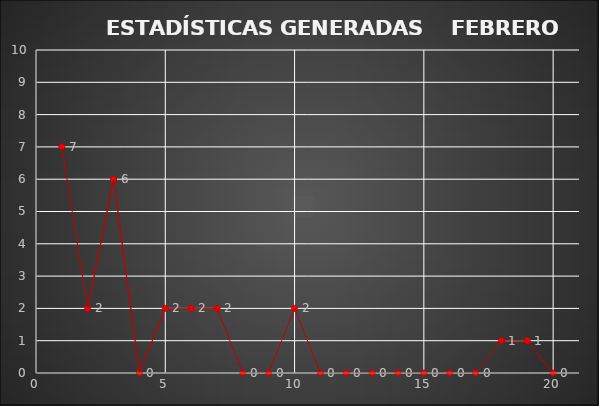
| Category |      ESTADÍSTICAS GENERADAS     PERIODO ENERO 2020 CANTIDAD |
|---|---|
| 0 | 7 |
| 1 | 2 |
| 2 | 6 |
| 3 | 0 |
| 4 | 2 |
| 5 | 2 |
| 6 | 2 |
| 7 | 0 |
| 8 | 0 |
| 9 | 2 |
| 10 | 0 |
| 11 | 0 |
| 12 | 0 |
| 13 | 0 |
| 14 | 0 |
| 15 | 0 |
| 16 | 0 |
| 17 | 1 |
| 18 | 1 |
| 19 | 0 |